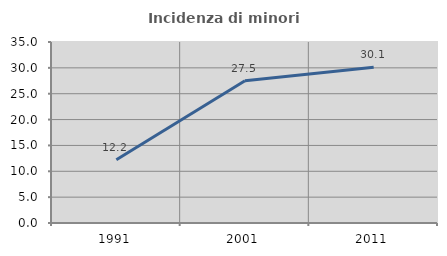
| Category | Incidenza di minori stranieri |
|---|---|
| 1991.0 | 12.245 |
| 2001.0 | 27.5 |
| 2011.0 | 30.116 |